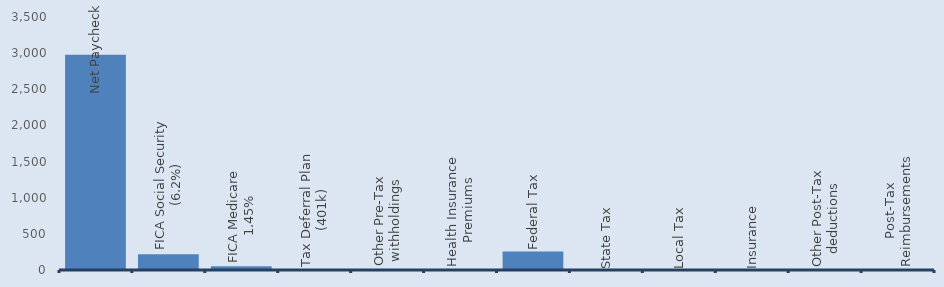
| Category | Series 0 |
|---|---|
| Net Paycheck | 2977.583 |
| FICA Social Security (6.2%) | 217 |
| FICA Medicare 1.45% | 50.75 |
| Tax Deferral Plan (401k) | 0 |
| Other Pre-Tax withholdings | 0 |
| Health Insurance Premiums | 0 |
| Federal Tax | 254.667 |
| State Tax | 0 |
| Local Tax | 0 |
| Insurance | 0 |
| Other Post-Tax deductions | 0 |
| Post-Tax Reimbursements | 0 |